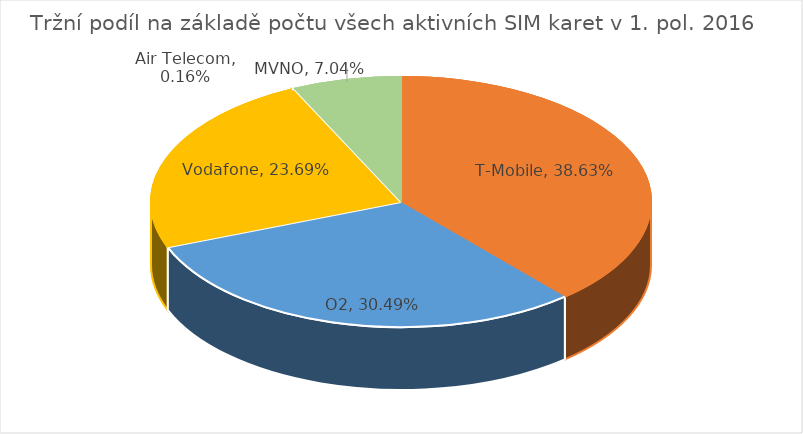
| Category | Series 0 |
|---|---|
| T-Mobile | 0.386 |
| O2 | 0.305 |
| Vodafone | 0.237 |
| Air Telecom | 0.002 |
| MVNO | 0.07 |